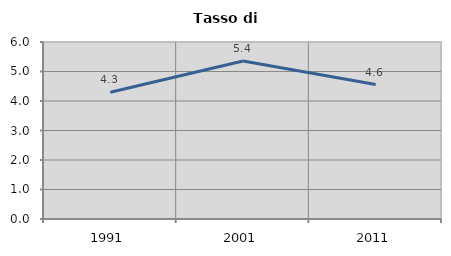
| Category | Tasso di disoccupazione   |
|---|---|
| 1991.0 | 4.299 |
| 2001.0 | 5.357 |
| 2011.0 | 4.556 |